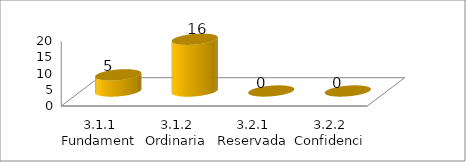
| Category | Series 0 |
|---|---|
| 3.1.1 Fundamental | 5 |
| 3.1.2 Ordinaria | 16 |
| 3.2.1 Reservada | 0 |
| 3.2.2 Confidencial | 0 |